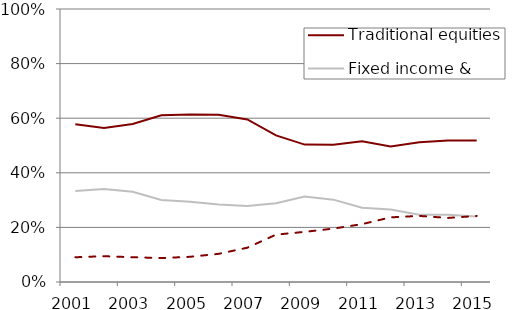
| Category | Traditional equities | Fixed income & cash | Alternatives |
|---|---|---|---|
| 2001.0 | 0.578 | 0.333 | 0.091 |
| 2002.0 | 0.564 | 0.341 | 0.095 |
| 2003.0 | 0.579 | 0.33 | 0.091 |
| 2004.0 | 0.611 | 0.301 | 0.088 |
| 2005.0 | 0.613 | 0.294 | 0.092 |
| 2006.0 | 0.612 | 0.283 | 0.103 |
| 2007.0 | 0.595 | 0.278 | 0.126 |
| 2008.0 | 0.537 | 0.289 | 0.173 |
| 2009.0 | 0.503 | 0.313 | 0.184 |
| 2010.0 | 0.503 | 0.302 | 0.196 |
| 2011.0 | 0.516 | 0.272 | 0.212 |
| 2012.0 | 0.497 | 0.266 | 0.237 |
| 2013.0 | 0.512 | 0.246 | 0.242 |
| 2014.0 | 0.519 | 0.247 | 0.235 |
| 2015.0 | 0.519 | 0.24 | 0.242 |